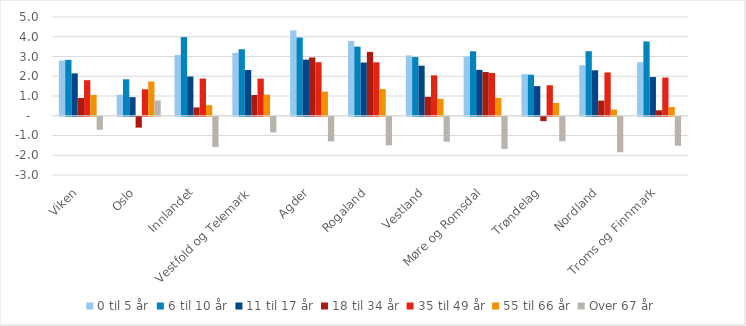
| Category | 0 til 5 år | 6 til 10 år | 11 til 17 år | 18 til 34 år | 35 til 49 år | 55 til 66 år | Over 67 år |
|---|---|---|---|---|---|---|---|
| Viken | 2.797 | 2.828 | 2.146 | 0.9 | 1.801 | 1.057 | -0.659 |
| Oslo | 1.062 | 1.846 | 0.942 | -0.552 | 1.339 | 1.734 | 0.776 |
| Innlandet | 3.076 | 3.982 | 1.987 | 0.421 | 1.884 | 0.534 | -1.528 |
| Vestfold og Telemark | 3.181 | 3.368 | 2.317 | 1.049 | 1.88 | 1.065 | -0.794 |
| Agder | 4.317 | 3.959 | 2.841 | 2.951 | 2.709 | 1.223 | -1.245 |
| Rogaland | 3.788 | 3.5 | 2.695 | 3.234 | 2.708 | 1.35 | -1.451 |
| Vestland | 3.055 | 2.973 | 2.534 | 0.957 | 2.045 | 0.859 | -1.264 |
| Møre og Romsdal | 2.997 | 3.263 | 2.324 | 2.213 | 2.164 | 0.908 | -1.632 |
| Trøndelag | 2.106 | 2.078 | 1.498 | -0.222 | 1.544 | 0.644 | -1.239 |
| Nordland | 2.56 | 3.267 | 2.301 | 0.765 | 2.193 | 0.312 | -1.796 |
| Troms og Finnmark | 2.712 | 3.763 | 1.96 | 0.275 | 1.935 | 0.443 | -1.469 |